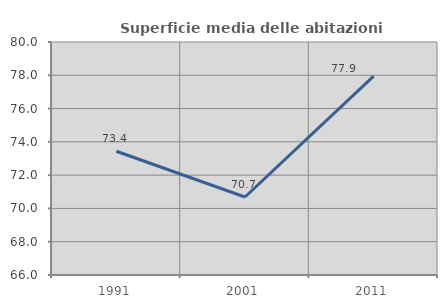
| Category | Superficie media delle abitazioni occupate |
|---|---|
| 1991.0 | 73.434 |
| 2001.0 | 70.688 |
| 2011.0 | 77.946 |